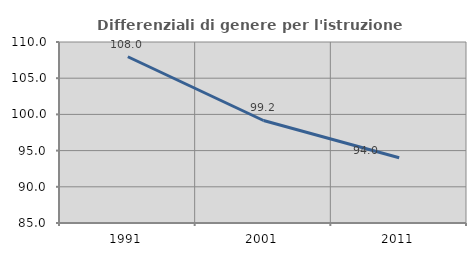
| Category | Differenziali di genere per l'istruzione superiore |
|---|---|
| 1991.0 | 107.961 |
| 2001.0 | 99.158 |
| 2011.0 | 94.014 |